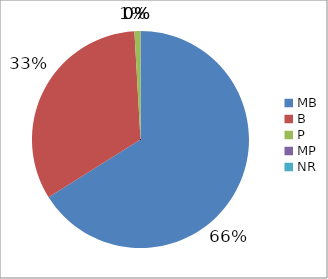
| Category | Series 0 |
|---|---|
| MB | 0.661 |
| B | 0.33 |
| P | 0.009 |
| MP | 0 |
| NR | 0 |